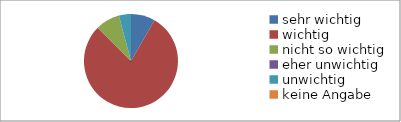
| Category | Series 0 |
|---|---|
| sehr wichtig | 2 |
| wichtig | 19 |
| nicht so wichtig | 2 |
| eher unwichtig | 0 |
| unwichtig | 1 |
| keine Angabe | 0 |